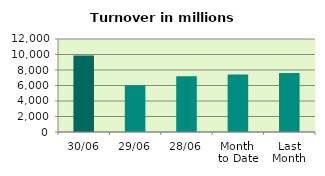
| Category | Series 0 |
|---|---|
| 30/06 | 9885.731 |
| 29/06 | 6042.808 |
| 28/06 | 7180.299 |
| Month 
to Date | 7424.465 |
| Last
Month | 7604.877 |